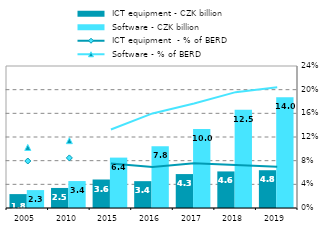
| Category |  ICT equipment - CZK billion |  Software - CZK billion |
|---|---|---|
| 2005.0 | 1.762 | 2.271 |
| 2010.0 | 2.54 | 3.415 |
| 2015.0 | 3.612 | 6.388 |
| 2016.0 | 3.403 | 7.83 |
| 2017.0 | 4.301 | 10.029 |
| 2018.0 | 4.637 | 12.464 |
| 2019.0 | 4.789 | 14.041 |